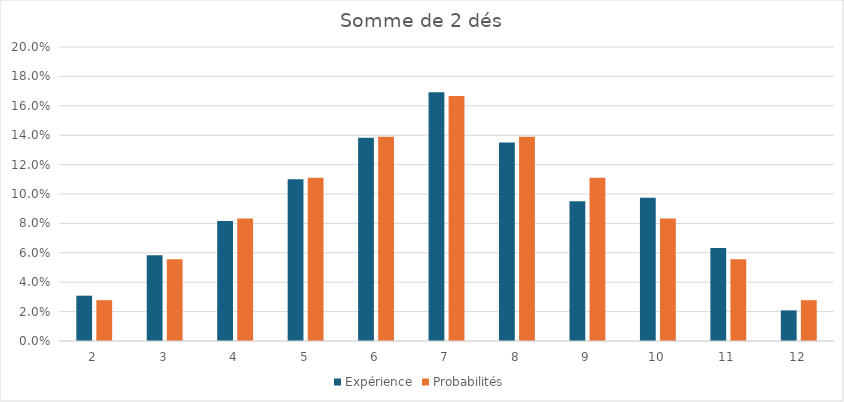
| Category | Expérience | Probabilités |
|---|---|---|
| 2.0 | 0.031 | 0.028 |
| 3.0 | 0.058 | 0.056 |
| 4.0 | 0.082 | 0.083 |
| 5.0 | 0.11 | 0.111 |
| 6.0 | 0.138 | 0.139 |
| 7.0 | 0.169 | 0.167 |
| 8.0 | 0.135 | 0.139 |
| 9.0 | 0.095 | 0.111 |
| 10.0 | 0.098 | 0.083 |
| 11.0 | 0.063 | 0.056 |
| 12.0 | 0.021 | 0.028 |